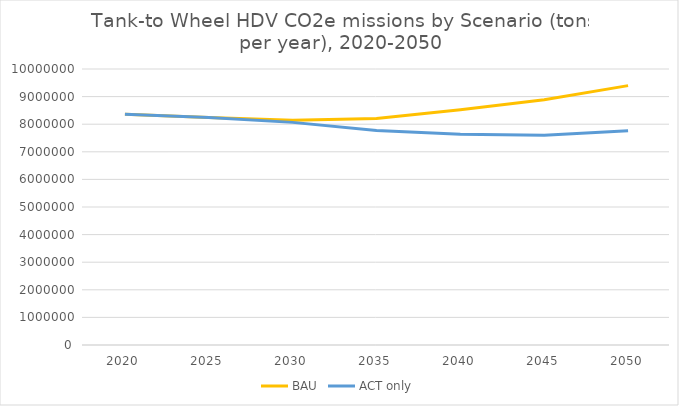
| Category | BAU | ACT only |
|---|---|---|
| 2020.0 | 8356302.968 | 8356302.968 |
| 2025.0 | 8243444.471 | 8243444.471 |
| 2030.0 | 8146842.29 | 8066099.426 |
| 2035.0 | 8206238.75 | 7769777.393 |
| 2040.0 | 8519392.352 | 7640165.754 |
| 2045.0 | 8885517.91 | 7599521.207 |
| 2050.0 | 9397936.085 | 7762703.231 |